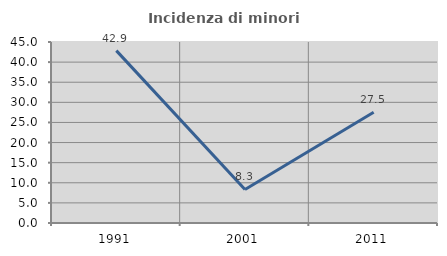
| Category | Incidenza di minori stranieri |
|---|---|
| 1991.0 | 42.857 |
| 2001.0 | 8.333 |
| 2011.0 | 27.536 |